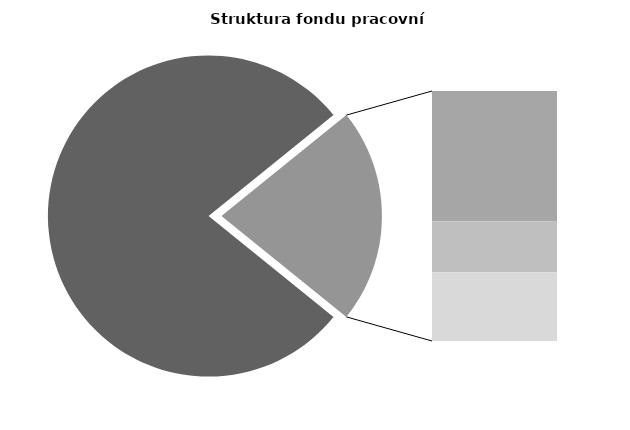
| Category | Series 0 |
|---|---|
| Průměrná měsíční odpracovaná doba bez přesčasu | 134.943 |
| Dovolená | 19.443 |
| Nemoc | 7.564 |
| Jiné | 10.225 |